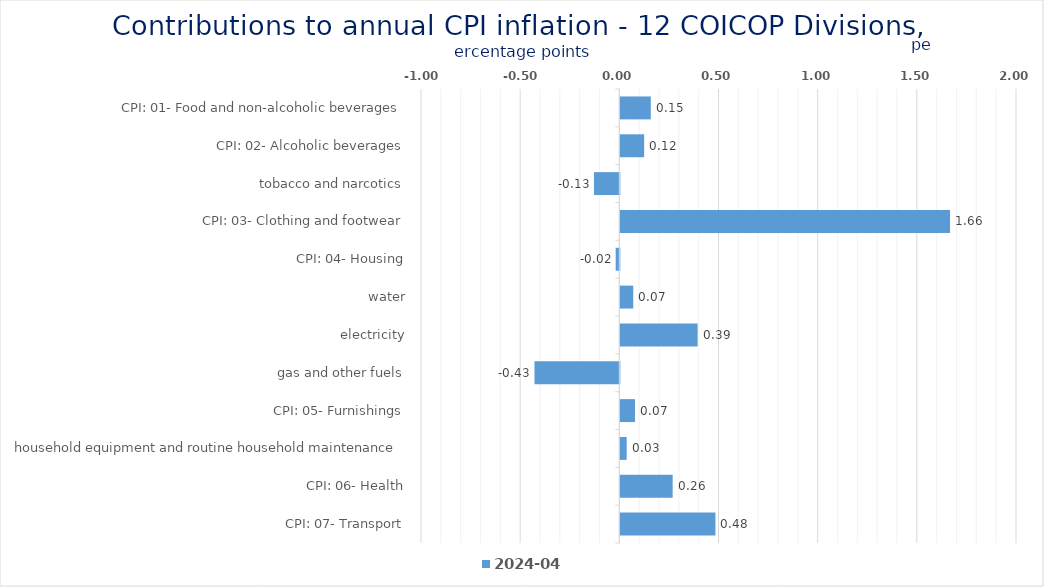
| Category | 2024-04 |
|---|---|
| CPI: 01- Food and non-alcoholic beverages | 0.154 |
| CPI: 02- Alcoholic beverages, tobacco and narcotics | 0.12 |
| CPI: 03- Clothing and footwear | -0.128 |
| CPI: 04- Housing, water, electricity, gas and other fuels | 1.662 |
| CPI: 05- Furnishings, household equipment and routine household maintenance | -0.018 |
| CPI: 06- Health | 0.065 |
| CPI: 07- Transport | 0.39 |
| CPI: 08- Communication | -0.428 |
| CPI: 09- Recreation and culture | 0.074 |
| CPI: 10- Education | 0.032 |
| CPI: 11- Restaurants and hotels | 0.264 |
| CPI: 12- Miscellaneous goods and services | 0.479 |